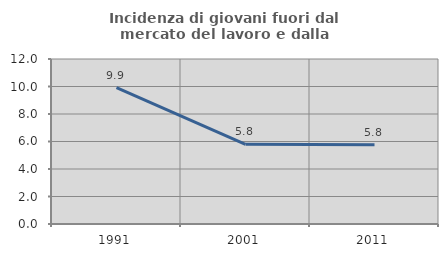
| Category | Incidenza di giovani fuori dal mercato del lavoro e dalla formazione  |
|---|---|
| 1991.0 | 9.916 |
| 2001.0 | 5.797 |
| 2011.0 | 5.759 |